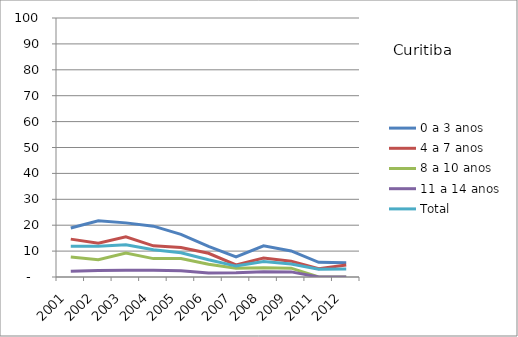
| Category | 0 a 3 anos | 4 a 7 anos | 8 a 10 anos | 11 a 14 anos | Total |
|---|---|---|---|---|---|
| 2001.0 | 18.89 | 14.63 | 7.73 | 2.19 | 11.89 |
| 2002.0 | 21.68 | 13.02 | 6.63 | 2.5 | 11.83 |
| 2003.0 | 20.9 | 15.51 | 9.23 | 2.59 | 12.44 |
| 2004.0 | 19.62 | 12.04 | 7.1 | 2.64 | 10.5 |
| 2005.0 | 16.47 | 11.42 | 7.16 | 2.45 | 9.38 |
| 2006.0 | 11.83 | 9.16 | 4.9 | 1.57 | 6.64 |
| 2007.0 | 7.77 | 4.65 | 3.42 | 1.67 | 4.21 |
| 2008.0 | 12.04 | 7.32 | 3.55 | 2.05 | 5.94 |
| 2009.0 | 10.05 | 6.11 | 3.4 | 1.97 | 5.01 |
| 2011.0 | 5.65 | 3.18 | 0 | 0 | 3 |
| 2012.0 | 5.49 | 4.62 | 0 | 0 | 3.13 |